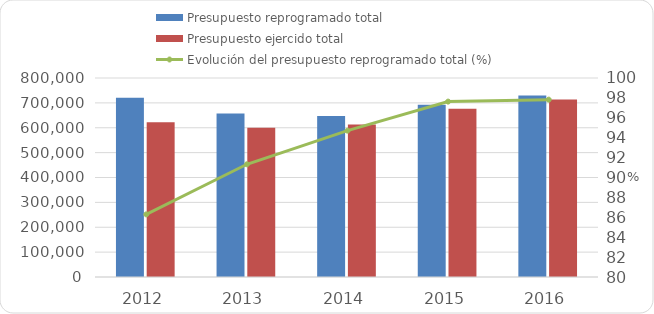
| Category | Presupuesto reprogramado total | Presupuesto ejercido total |
|---|---|---|
| 2012 | 720679.2 | 621909.5 |
| 2013 | 657148.1 | 600163.1 |
| 2014 | 647302.9 | 613052.1 |
| 2015 | 692840.462 | 676403.338 |
| 2016 | 729594.261 | 713725.8 |